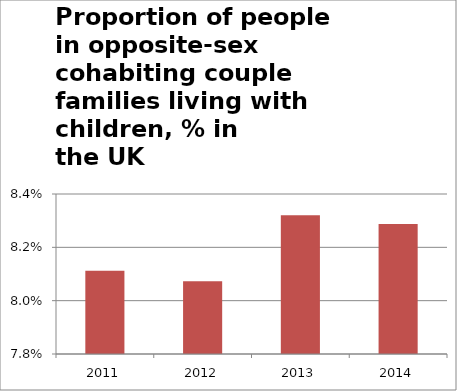
| Category | Series 1 |
|---|---|
| 2011.0 | 0.081 |
| 2012.0 | 0.081 |
| 2013.0 | 0.083 |
| 2014.0 | 0.083 |